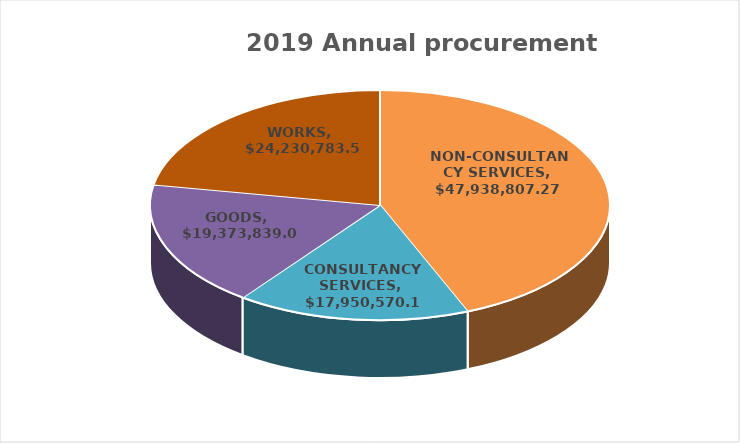
| Category | Series 0 |
|---|---|
| NON-CONSULTANCY SERVICES | 47938807.267 |
| CONSULTANCY SERVICES | 17950570.103 |
| GOODS | 19373839.09 |
| WORKS | 24230783.58 |